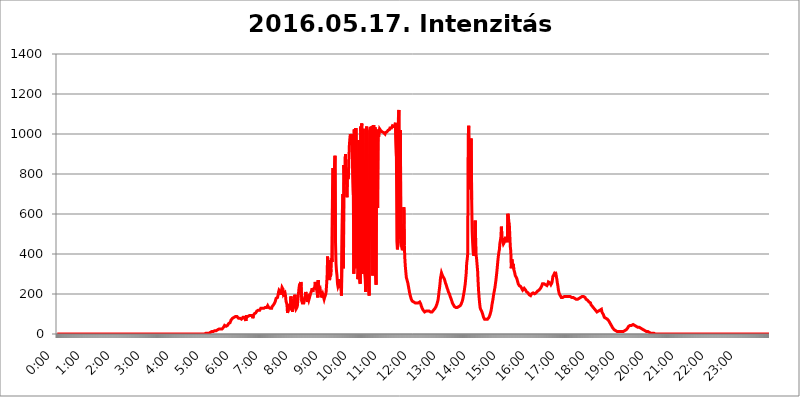
| Category | 2016.05.17. Intenzitás [W/m^2] |
|---|---|
| 0.0 | 0 |
| 0.0006944444444444445 | 0 |
| 0.001388888888888889 | 0 |
| 0.0020833333333333333 | 0 |
| 0.002777777777777778 | 0 |
| 0.003472222222222222 | 0 |
| 0.004166666666666667 | 0 |
| 0.004861111111111111 | 0 |
| 0.005555555555555556 | 0 |
| 0.0062499999999999995 | 0 |
| 0.006944444444444444 | 0 |
| 0.007638888888888889 | 0 |
| 0.008333333333333333 | 0 |
| 0.009027777777777779 | 0 |
| 0.009722222222222222 | 0 |
| 0.010416666666666666 | 0 |
| 0.011111111111111112 | 0 |
| 0.011805555555555555 | 0 |
| 0.012499999999999999 | 0 |
| 0.013194444444444444 | 0 |
| 0.013888888888888888 | 0 |
| 0.014583333333333332 | 0 |
| 0.015277777777777777 | 0 |
| 0.015972222222222224 | 0 |
| 0.016666666666666666 | 0 |
| 0.017361111111111112 | 0 |
| 0.018055555555555557 | 0 |
| 0.01875 | 0 |
| 0.019444444444444445 | 0 |
| 0.02013888888888889 | 0 |
| 0.020833333333333332 | 0 |
| 0.02152777777777778 | 0 |
| 0.022222222222222223 | 0 |
| 0.02291666666666667 | 0 |
| 0.02361111111111111 | 0 |
| 0.024305555555555556 | 0 |
| 0.024999999999999998 | 0 |
| 0.025694444444444447 | 0 |
| 0.02638888888888889 | 0 |
| 0.027083333333333334 | 0 |
| 0.027777777777777776 | 0 |
| 0.02847222222222222 | 0 |
| 0.029166666666666664 | 0 |
| 0.029861111111111113 | 0 |
| 0.030555555555555555 | 0 |
| 0.03125 | 0 |
| 0.03194444444444445 | 0 |
| 0.03263888888888889 | 0 |
| 0.03333333333333333 | 0 |
| 0.034027777777777775 | 0 |
| 0.034722222222222224 | 0 |
| 0.035416666666666666 | 0 |
| 0.036111111111111115 | 0 |
| 0.03680555555555556 | 0 |
| 0.0375 | 0 |
| 0.03819444444444444 | 0 |
| 0.03888888888888889 | 0 |
| 0.03958333333333333 | 0 |
| 0.04027777777777778 | 0 |
| 0.04097222222222222 | 0 |
| 0.041666666666666664 | 0 |
| 0.042361111111111106 | 0 |
| 0.04305555555555556 | 0 |
| 0.043750000000000004 | 0 |
| 0.044444444444444446 | 0 |
| 0.04513888888888889 | 0 |
| 0.04583333333333334 | 0 |
| 0.04652777777777778 | 0 |
| 0.04722222222222222 | 0 |
| 0.04791666666666666 | 0 |
| 0.04861111111111111 | 0 |
| 0.049305555555555554 | 0 |
| 0.049999999999999996 | 0 |
| 0.05069444444444445 | 0 |
| 0.051388888888888894 | 0 |
| 0.052083333333333336 | 0 |
| 0.05277777777777778 | 0 |
| 0.05347222222222222 | 0 |
| 0.05416666666666667 | 0 |
| 0.05486111111111111 | 0 |
| 0.05555555555555555 | 0 |
| 0.05625 | 0 |
| 0.05694444444444444 | 0 |
| 0.057638888888888885 | 0 |
| 0.05833333333333333 | 0 |
| 0.05902777777777778 | 0 |
| 0.059722222222222225 | 0 |
| 0.06041666666666667 | 0 |
| 0.061111111111111116 | 0 |
| 0.06180555555555556 | 0 |
| 0.0625 | 0 |
| 0.06319444444444444 | 0 |
| 0.06388888888888888 | 0 |
| 0.06458333333333334 | 0 |
| 0.06527777777777778 | 0 |
| 0.06597222222222222 | 0 |
| 0.06666666666666667 | 0 |
| 0.06736111111111111 | 0 |
| 0.06805555555555555 | 0 |
| 0.06874999999999999 | 0 |
| 0.06944444444444443 | 0 |
| 0.07013888888888889 | 0 |
| 0.07083333333333333 | 0 |
| 0.07152777777777779 | 0 |
| 0.07222222222222223 | 0 |
| 0.07291666666666667 | 0 |
| 0.07361111111111111 | 0 |
| 0.07430555555555556 | 0 |
| 0.075 | 0 |
| 0.07569444444444444 | 0 |
| 0.0763888888888889 | 0 |
| 0.07708333333333334 | 0 |
| 0.07777777777777778 | 0 |
| 0.07847222222222222 | 0 |
| 0.07916666666666666 | 0 |
| 0.0798611111111111 | 0 |
| 0.08055555555555556 | 0 |
| 0.08125 | 0 |
| 0.08194444444444444 | 0 |
| 0.08263888888888889 | 0 |
| 0.08333333333333333 | 0 |
| 0.08402777777777777 | 0 |
| 0.08472222222222221 | 0 |
| 0.08541666666666665 | 0 |
| 0.08611111111111112 | 0 |
| 0.08680555555555557 | 0 |
| 0.08750000000000001 | 0 |
| 0.08819444444444445 | 0 |
| 0.08888888888888889 | 0 |
| 0.08958333333333333 | 0 |
| 0.09027777777777778 | 0 |
| 0.09097222222222222 | 0 |
| 0.09166666666666667 | 0 |
| 0.09236111111111112 | 0 |
| 0.09305555555555556 | 0 |
| 0.09375 | 0 |
| 0.09444444444444444 | 0 |
| 0.09513888888888888 | 0 |
| 0.09583333333333333 | 0 |
| 0.09652777777777777 | 0 |
| 0.09722222222222222 | 0 |
| 0.09791666666666667 | 0 |
| 0.09861111111111111 | 0 |
| 0.09930555555555555 | 0 |
| 0.09999999999999999 | 0 |
| 0.10069444444444443 | 0 |
| 0.1013888888888889 | 0 |
| 0.10208333333333335 | 0 |
| 0.10277777777777779 | 0 |
| 0.10347222222222223 | 0 |
| 0.10416666666666667 | 0 |
| 0.10486111111111111 | 0 |
| 0.10555555555555556 | 0 |
| 0.10625 | 0 |
| 0.10694444444444444 | 0 |
| 0.1076388888888889 | 0 |
| 0.10833333333333334 | 0 |
| 0.10902777777777778 | 0 |
| 0.10972222222222222 | 0 |
| 0.1111111111111111 | 0 |
| 0.11180555555555556 | 0 |
| 0.11180555555555556 | 0 |
| 0.1125 | 0 |
| 0.11319444444444444 | 0 |
| 0.11388888888888889 | 0 |
| 0.11458333333333333 | 0 |
| 0.11527777777777777 | 0 |
| 0.11597222222222221 | 0 |
| 0.11666666666666665 | 0 |
| 0.1173611111111111 | 0 |
| 0.11805555555555557 | 0 |
| 0.11944444444444445 | 0 |
| 0.12013888888888889 | 0 |
| 0.12083333333333333 | 0 |
| 0.12152777777777778 | 0 |
| 0.12222222222222223 | 0 |
| 0.12291666666666667 | 0 |
| 0.12291666666666667 | 0 |
| 0.12361111111111112 | 0 |
| 0.12430555555555556 | 0 |
| 0.125 | 0 |
| 0.12569444444444444 | 0 |
| 0.12638888888888888 | 0 |
| 0.12708333333333333 | 0 |
| 0.16875 | 0 |
| 0.12847222222222224 | 0 |
| 0.12916666666666668 | 0 |
| 0.12986111111111112 | 0 |
| 0.13055555555555556 | 0 |
| 0.13125 | 0 |
| 0.13194444444444445 | 0 |
| 0.1326388888888889 | 0 |
| 0.13333333333333333 | 0 |
| 0.13402777777777777 | 0 |
| 0.13402777777777777 | 0 |
| 0.13472222222222222 | 0 |
| 0.13541666666666666 | 0 |
| 0.1361111111111111 | 0 |
| 0.13749999999999998 | 0 |
| 0.13819444444444443 | 0 |
| 0.1388888888888889 | 0 |
| 0.13958333333333334 | 0 |
| 0.14027777777777778 | 0 |
| 0.14097222222222222 | 0 |
| 0.14166666666666666 | 0 |
| 0.1423611111111111 | 0 |
| 0.14305555555555557 | 0 |
| 0.14375000000000002 | 0 |
| 0.14444444444444446 | 0 |
| 0.1451388888888889 | 0 |
| 0.1451388888888889 | 0 |
| 0.14652777777777778 | 0 |
| 0.14722222222222223 | 0 |
| 0.14791666666666667 | 0 |
| 0.1486111111111111 | 0 |
| 0.14930555555555555 | 0 |
| 0.15 | 0 |
| 0.15069444444444444 | 0 |
| 0.15138888888888888 | 0 |
| 0.15208333333333332 | 0 |
| 0.15277777777777776 | 0 |
| 0.15347222222222223 | 0 |
| 0.15416666666666667 | 0 |
| 0.15486111111111112 | 0 |
| 0.15555555555555556 | 0 |
| 0.15625 | 0 |
| 0.15694444444444444 | 0 |
| 0.15763888888888888 | 0 |
| 0.15833333333333333 | 0 |
| 0.15902777777777777 | 0 |
| 0.15972222222222224 | 0 |
| 0.16041666666666668 | 0 |
| 0.16111111111111112 | 0 |
| 0.16180555555555556 | 0 |
| 0.1625 | 0 |
| 0.16319444444444445 | 0 |
| 0.1638888888888889 | 0 |
| 0.16458333333333333 | 0 |
| 0.16527777777777777 | 0 |
| 0.16597222222222222 | 0 |
| 0.16666666666666666 | 0 |
| 0.1673611111111111 | 0 |
| 0.16805555555555554 | 0 |
| 0.16874999999999998 | 0 |
| 0.16944444444444443 | 0 |
| 0.17013888888888887 | 0 |
| 0.1708333333333333 | 0 |
| 0.17152777777777775 | 0 |
| 0.17222222222222225 | 0 |
| 0.1729166666666667 | 0 |
| 0.17361111111111113 | 0 |
| 0.17430555555555557 | 0 |
| 0.17500000000000002 | 0 |
| 0.17569444444444446 | 0 |
| 0.1763888888888889 | 0 |
| 0.17708333333333334 | 0 |
| 0.17777777777777778 | 0 |
| 0.17847222222222223 | 0 |
| 0.17916666666666667 | 0 |
| 0.1798611111111111 | 0 |
| 0.18055555555555555 | 0 |
| 0.18125 | 0 |
| 0.18194444444444444 | 0 |
| 0.1826388888888889 | 0 |
| 0.18333333333333335 | 0 |
| 0.1840277777777778 | 0 |
| 0.18472222222222223 | 0 |
| 0.18541666666666667 | 0 |
| 0.18611111111111112 | 0 |
| 0.18680555555555556 | 0 |
| 0.1875 | 0 |
| 0.18819444444444444 | 0 |
| 0.18888888888888888 | 0 |
| 0.18958333333333333 | 0 |
| 0.19027777777777777 | 0 |
| 0.1909722222222222 | 0 |
| 0.19166666666666665 | 0 |
| 0.19236111111111112 | 0 |
| 0.19305555555555554 | 0 |
| 0.19375 | 0 |
| 0.19444444444444445 | 0 |
| 0.1951388888888889 | 0 |
| 0.19583333333333333 | 0 |
| 0.19652777777777777 | 0 |
| 0.19722222222222222 | 0 |
| 0.19791666666666666 | 0 |
| 0.1986111111111111 | 0 |
| 0.19930555555555554 | 0 |
| 0.19999999999999998 | 0 |
| 0.20069444444444443 | 0 |
| 0.20138888888888887 | 0 |
| 0.2020833333333333 | 0 |
| 0.2027777777777778 | 0 |
| 0.2034722222222222 | 0 |
| 0.2041666666666667 | 0 |
| 0.20486111111111113 | 0 |
| 0.20555555555555557 | 0 |
| 0.20625000000000002 | 0 |
| 0.20694444444444446 | 0 |
| 0.2076388888888889 | 0 |
| 0.20833333333333334 | 3.525 |
| 0.20902777777777778 | 3.525 |
| 0.20972222222222223 | 3.525 |
| 0.21041666666666667 | 3.525 |
| 0.2111111111111111 | 3.525 |
| 0.21180555555555555 | 3.525 |
| 0.2125 | 3.525 |
| 0.21319444444444444 | 7.887 |
| 0.2138888888888889 | 7.887 |
| 0.21458333333333335 | 7.887 |
| 0.2152777777777778 | 7.887 |
| 0.21597222222222223 | 12.257 |
| 0.21666666666666667 | 12.257 |
| 0.21736111111111112 | 12.257 |
| 0.21805555555555556 | 12.257 |
| 0.21875 | 12.257 |
| 0.21944444444444444 | 16.636 |
| 0.22013888888888888 | 16.636 |
| 0.22083333333333333 | 16.636 |
| 0.22152777777777777 | 16.636 |
| 0.2222222222222222 | 16.636 |
| 0.22291666666666665 | 16.636 |
| 0.2236111111111111 | 16.636 |
| 0.22430555555555556 | 21.024 |
| 0.225 | 21.024 |
| 0.22569444444444445 | 21.024 |
| 0.2263888888888889 | 21.024 |
| 0.22708333333333333 | 25.419 |
| 0.22777777777777777 | 29.823 |
| 0.22847222222222222 | 29.823 |
| 0.22916666666666666 | 25.419 |
| 0.2298611111111111 | 25.419 |
| 0.23055555555555554 | 25.419 |
| 0.23124999999999998 | 25.419 |
| 0.23194444444444443 | 29.823 |
| 0.23263888888888887 | 29.823 |
| 0.2333333333333333 | 34.234 |
| 0.2340277777777778 | 38.653 |
| 0.2347222222222222 | 43.079 |
| 0.2354166666666667 | 43.079 |
| 0.23611111111111113 | 38.653 |
| 0.23680555555555557 | 38.653 |
| 0.23750000000000002 | 38.653 |
| 0.23819444444444446 | 43.079 |
| 0.2388888888888889 | 43.079 |
| 0.23958333333333334 | 47.511 |
| 0.24027777777777778 | 51.951 |
| 0.24097222222222223 | 56.398 |
| 0.24166666666666667 | 51.951 |
| 0.2423611111111111 | 56.398 |
| 0.24305555555555555 | 60.85 |
| 0.24375 | 69.775 |
| 0.24444444444444446 | 74.246 |
| 0.24513888888888888 | 74.246 |
| 0.24583333333333335 | 78.722 |
| 0.2465277777777778 | 78.722 |
| 0.24722222222222223 | 83.205 |
| 0.24791666666666667 | 83.205 |
| 0.24861111111111112 | 83.205 |
| 0.24930555555555556 | 87.692 |
| 0.25 | 87.692 |
| 0.25069444444444444 | 92.184 |
| 0.2513888888888889 | 92.184 |
| 0.2520833333333333 | 87.692 |
| 0.25277777777777777 | 83.205 |
| 0.2534722222222222 | 83.205 |
| 0.25416666666666665 | 78.722 |
| 0.2548611111111111 | 78.722 |
| 0.2555555555555556 | 78.722 |
| 0.25625000000000003 | 78.722 |
| 0.2569444444444445 | 74.246 |
| 0.2576388888888889 | 74.246 |
| 0.25833333333333336 | 74.246 |
| 0.2590277777777778 | 74.246 |
| 0.25972222222222224 | 78.722 |
| 0.2604166666666667 | 83.205 |
| 0.2611111111111111 | 87.692 |
| 0.26180555555555557 | 87.692 |
| 0.2625 | 83.205 |
| 0.26319444444444445 | 83.205 |
| 0.2638888888888889 | 83.205 |
| 0.26458333333333334 | 65.31 |
| 0.2652777777777778 | 87.692 |
| 0.2659722222222222 | 87.692 |
| 0.26666666666666666 | 87.692 |
| 0.2673611111111111 | 87.692 |
| 0.26805555555555555 | 92.184 |
| 0.26875 | 92.184 |
| 0.26944444444444443 | 92.184 |
| 0.2701388888888889 | 92.184 |
| 0.2708333333333333 | 92.184 |
| 0.27152777777777776 | 92.184 |
| 0.2722222222222222 | 92.184 |
| 0.27291666666666664 | 92.184 |
| 0.2736111111111111 | 92.184 |
| 0.2743055555555555 | 78.722 |
| 0.27499999999999997 | 92.184 |
| 0.27569444444444446 | 96.682 |
| 0.27638888888888885 | 101.184 |
| 0.27708333333333335 | 101.184 |
| 0.2777777777777778 | 101.184 |
| 0.27847222222222223 | 105.69 |
| 0.2791666666666667 | 110.201 |
| 0.2798611111111111 | 114.716 |
| 0.28055555555555556 | 114.716 |
| 0.28125 | 119.235 |
| 0.28194444444444444 | 119.235 |
| 0.2826388888888889 | 119.235 |
| 0.2833333333333333 | 119.235 |
| 0.28402777777777777 | 119.235 |
| 0.2847222222222222 | 123.758 |
| 0.28541666666666665 | 128.284 |
| 0.28611111111111115 | 128.284 |
| 0.28680555555555554 | 128.284 |
| 0.28750000000000003 | 128.284 |
| 0.2881944444444445 | 123.758 |
| 0.2888888888888889 | 123.758 |
| 0.28958333333333336 | 128.284 |
| 0.2902777777777778 | 132.814 |
| 0.29097222222222224 | 132.814 |
| 0.2916666666666667 | 132.814 |
| 0.2923611111111111 | 132.814 |
| 0.29305555555555557 | 132.814 |
| 0.29375 | 132.814 |
| 0.29444444444444445 | 137.347 |
| 0.2951388888888889 | 141.884 |
| 0.29583333333333334 | 137.347 |
| 0.2965277777777778 | 132.814 |
| 0.2972222222222222 | 137.347 |
| 0.29791666666666666 | 132.814 |
| 0.2986111111111111 | 128.284 |
| 0.29930555555555555 | 128.284 |
| 0.3 | 128.284 |
| 0.30069444444444443 | 128.284 |
| 0.3013888888888889 | 137.347 |
| 0.3020833333333333 | 137.347 |
| 0.30277777777777776 | 141.884 |
| 0.3034722222222222 | 146.423 |
| 0.30416666666666664 | 146.423 |
| 0.3048611111111111 | 141.884 |
| 0.3055555555555555 | 160.056 |
| 0.30624999999999997 | 164.605 |
| 0.3069444444444444 | 178.264 |
| 0.3076388888888889 | 178.264 |
| 0.30833333333333335 | 182.82 |
| 0.3090277777777778 | 182.82 |
| 0.30972222222222223 | 187.378 |
| 0.3104166666666667 | 210.182 |
| 0.3111111111111111 | 219.309 |
| 0.31180555555555556 | 223.873 |
| 0.3125 | 219.309 |
| 0.31319444444444444 | 210.182 |
| 0.3138888888888889 | 196.497 |
| 0.3145833333333333 | 219.309 |
| 0.31527777777777777 | 233 |
| 0.3159722222222222 | 237.564 |
| 0.31666666666666665 | 223.873 |
| 0.31736111111111115 | 196.497 |
| 0.31805555555555554 | 196.497 |
| 0.31875000000000003 | 196.497 |
| 0.3194444444444445 | 205.62 |
| 0.3201388888888889 | 191.937 |
| 0.32083333333333336 | 164.605 |
| 0.3215277777777778 | 164.605 |
| 0.32222222222222224 | 146.423 |
| 0.3229166666666667 | 105.69 |
| 0.3236111111111111 | 101.184 |
| 0.32430555555555557 | 123.758 |
| 0.325 | 150.964 |
| 0.32569444444444445 | 146.423 |
| 0.3263888888888889 | 155.509 |
| 0.32708333333333334 | 128.284 |
| 0.3277777777777778 | 187.378 |
| 0.3284722222222222 | 119.235 |
| 0.32916666666666666 | 173.709 |
| 0.3298611111111111 | 110.201 |
| 0.33055555555555555 | 155.509 |
| 0.33125 | 141.884 |
| 0.33194444444444443 | 164.605 |
| 0.3326388888888889 | 132.814 |
| 0.3333333333333333 | 196.497 |
| 0.3340277777777778 | 132.814 |
| 0.3347222222222222 | 123.758 |
| 0.3354166666666667 | 128.284 |
| 0.3361111111111111 | 132.814 |
| 0.3368055555555556 | 141.884 |
| 0.33749999999999997 | 141.884 |
| 0.33819444444444446 | 141.884 |
| 0.33888888888888885 | 223.873 |
| 0.33958333333333335 | 242.127 |
| 0.34027777777777773 | 251.251 |
| 0.34097222222222223 | 214.746 |
| 0.3416666666666666 | 260.373 |
| 0.3423611111111111 | 255.813 |
| 0.3430555555555555 | 164.605 |
| 0.34375 | 155.509 |
| 0.3444444444444445 | 150.964 |
| 0.3451388888888889 | 150.964 |
| 0.3458333333333334 | 155.509 |
| 0.34652777777777777 | 160.056 |
| 0.34722222222222227 | 178.264 |
| 0.34791666666666665 | 196.497 |
| 0.34861111111111115 | 210.182 |
| 0.34930555555555554 | 205.62 |
| 0.35000000000000003 | 178.264 |
| 0.3506944444444444 | 160.056 |
| 0.3513888888888889 | 169.156 |
| 0.3520833333333333 | 178.264 |
| 0.3527777777777778 | 169.156 |
| 0.3534722222222222 | 178.264 |
| 0.3541666666666667 | 187.378 |
| 0.3548611111111111 | 196.497 |
| 0.35555555555555557 | 196.497 |
| 0.35625 | 201.058 |
| 0.35694444444444445 | 219.309 |
| 0.3576388888888889 | 228.436 |
| 0.35833333333333334 | 210.182 |
| 0.3590277777777778 | 223.873 |
| 0.3597222222222222 | 228.436 |
| 0.36041666666666666 | 223.873 |
| 0.3611111111111111 | 233 |
| 0.36180555555555555 | 260.373 |
| 0.3625 | 260.373 |
| 0.36319444444444443 | 228.436 |
| 0.3638888888888889 | 219.309 |
| 0.3645833333333333 | 205.62 |
| 0.3652777777777778 | 182.82 |
| 0.3659722222222222 | 269.49 |
| 0.3666666666666667 | 223.873 |
| 0.3673611111111111 | 214.746 |
| 0.3680555555555556 | 210.182 |
| 0.36874999999999997 | 223.873 |
| 0.36944444444444446 | 205.62 |
| 0.37013888888888885 | 182.82 |
| 0.37083333333333335 | 178.264 |
| 0.37152777777777773 | 187.378 |
| 0.37222222222222223 | 201.058 |
| 0.3729166666666666 | 196.497 |
| 0.3736111111111111 | 182.82 |
| 0.3743055555555555 | 173.709 |
| 0.375 | 182.82 |
| 0.3756944444444445 | 187.378 |
| 0.3763888888888889 | 196.497 |
| 0.3770833333333334 | 210.182 |
| 0.37777777777777777 | 246.689 |
| 0.37847222222222227 | 287.709 |
| 0.37916666666666665 | 387.202 |
| 0.37986111111111115 | 319.517 |
| 0.38055555555555554 | 369.23 |
| 0.38125000000000003 | 287.709 |
| 0.3819444444444444 | 269.49 |
| 0.3826388888888889 | 296.808 |
| 0.3833333333333333 | 287.709 |
| 0.3840277777777778 | 324.052 |
| 0.3847222222222222 | 378.224 |
| 0.3854166666666667 | 360.221 |
| 0.3861111111111111 | 727.896 |
| 0.38680555555555557 | 829.981 |
| 0.3875 | 545.416 |
| 0.38819444444444445 | 613.252 |
| 0.3888888888888889 | 845.365 |
| 0.38958333333333334 | 891.099 |
| 0.3902777777777778 | 458.38 |
| 0.3909722222222222 | 351.198 |
| 0.39166666666666666 | 314.98 |
| 0.3923611111111111 | 292.259 |
| 0.39305555555555555 | 251.251 |
| 0.39375 | 237.564 |
| 0.39444444444444443 | 242.127 |
| 0.3951388888888889 | 251.251 |
| 0.3958333333333333 | 274.047 |
| 0.3965277777777778 | 237.564 |
| 0.3972222222222222 | 242.127 |
| 0.3979166666666667 | 228.436 |
| 0.3986111111111111 | 191.937 |
| 0.3993055555555556 | 196.497 |
| 0.39999999999999997 | 621.613 |
| 0.40069444444444446 | 699.717 |
| 0.40138888888888885 | 328.584 |
| 0.40208333333333335 | 845.365 |
| 0.40277777777777773 | 798.974 |
| 0.40347222222222223 | 759.723 |
| 0.4041666666666666 | 898.668 |
| 0.4048611111111111 | 829.981 |
| 0.4055555555555555 | 798.974 |
| 0.40625 | 683.473 |
| 0.4069444444444445 | 798.974 |
| 0.4076388888888889 | 775.492 |
| 0.4083333333333334 | 783.342 |
| 0.40902777777777777 | 875.918 |
| 0.40972222222222227 | 943.832 |
| 0.41041666666666665 | 977.508 |
| 0.41111111111111115 | 999.916 |
| 0.41180555555555554 | 981.244 |
| 0.41250000000000003 | 988.714 |
| 0.4131944444444444 | 999.916 |
| 0.4138888888888889 | 1003.65 |
| 0.4145833333333333 | 1003.65 |
| 0.4152777777777778 | 695.666 |
| 0.4159722222222222 | 301.354 |
| 0.4166666666666667 | 1022.323 |
| 0.4173611111111111 | 440.702 |
| 0.41805555555555557 | 328.584 |
| 0.41875 | 1029.798 |
| 0.41944444444444445 | 1026.06 |
| 0.4201388888888889 | 814.519 |
| 0.42083333333333334 | 658.909 |
| 0.4215277777777778 | 274.047 |
| 0.4222222222222222 | 305.898 |
| 0.42291666666666666 | 970.034 |
| 0.4236111111111111 | 328.584 |
| 0.42430555555555555 | 260.373 |
| 0.425 | 251.251 |
| 0.42569444444444443 | 1037.277 |
| 0.4263888888888889 | 1014.852 |
| 0.4270833333333333 | 1052.255 |
| 0.4277777777777778 | 301.354 |
| 0.4284722222222222 | 445.129 |
| 0.4291666666666667 | 1026.06 |
| 0.4298611111111111 | 1029.798 |
| 0.4305555555555556 | 360.221 |
| 0.43124999999999997 | 301.354 |
| 0.43194444444444446 | 274.047 |
| 0.43263888888888885 | 210.182 |
| 0.43333333333333335 | 1018.587 |
| 0.43402777777777773 | 1037.277 |
| 0.43472222222222223 | 775.492 |
| 0.4354166666666666 | 305.898 |
| 0.4361111111111111 | 274.047 |
| 0.4368055555555555 | 223.873 |
| 0.4375 | 191.937 |
| 0.4381944444444445 | 1018.587 |
| 0.4388888888888889 | 1029.798 |
| 0.4395833333333334 | 1029.798 |
| 0.44027777777777777 | 1026.06 |
| 0.44097222222222227 | 1033.537 |
| 0.44166666666666665 | 1037.277 |
| 0.44236111111111115 | 292.259 |
| 0.44305555555555554 | 613.252 |
| 0.44375000000000003 | 1044.762 |
| 0.4444444444444444 | 996.182 |
| 0.4451388888888889 | 1007.383 |
| 0.4458333333333333 | 1033.537 |
| 0.4465277777777778 | 287.709 |
| 0.4472222222222222 | 246.689 |
| 0.4479166666666667 | 1011.118 |
| 0.4486111111111111 | 1022.323 |
| 0.44930555555555557 | 629.948 |
| 0.45 | 1011.118 |
| 0.45069444444444445 | 984.98 |
| 0.4513888888888889 | 1011.118 |
| 0.45208333333333334 | 1026.06 |
| 0.4527777777777778 | 1022.323 |
| 0.4534722222222222 | 1018.587 |
| 0.45416666666666666 | 1014.852 |
| 0.4548611111111111 | 1014.852 |
| 0.45555555555555555 | 1011.118 |
| 0.45625 | 1007.383 |
| 0.45694444444444443 | 1007.383 |
| 0.4576388888888889 | 1007.383 |
| 0.4583333333333333 | 1007.383 |
| 0.4590277777777778 | 1007.383 |
| 0.4597222222222222 | 999.916 |
| 0.4604166666666667 | 1007.383 |
| 0.4611111111111111 | 1003.65 |
| 0.4618055555555556 | 1007.383 |
| 0.46249999999999997 | 1011.118 |
| 0.46319444444444446 | 1007.383 |
| 0.46388888888888885 | 1018.587 |
| 0.46458333333333335 | 1014.852 |
| 0.46527777777777773 | 1018.587 |
| 0.46597222222222223 | 1022.323 |
| 0.4666666666666666 | 1029.798 |
| 0.4673611111111111 | 1033.537 |
| 0.4680555555555555 | 1033.537 |
| 0.46875 | 1029.798 |
| 0.4694444444444445 | 1033.537 |
| 0.4701388888888889 | 1041.019 |
| 0.4708333333333334 | 1041.019 |
| 0.47152777777777777 | 1037.277 |
| 0.47222222222222227 | 1037.277 |
| 0.47291666666666665 | 1041.019 |
| 0.47361111111111115 | 1044.762 |
| 0.47430555555555554 | 1056.004 |
| 0.47500000000000003 | 1059.756 |
| 0.4756944444444444 | 887.309 |
| 0.4763888888888889 | 462.786 |
| 0.4770833333333333 | 422.943 |
| 0.4777777777777778 | 449.551 |
| 0.4784722222222222 | 1078.555 |
| 0.4791666666666667 | 1120.238 |
| 0.4798611111111111 | 515.223 |
| 0.48055555555555557 | 475.972 |
| 0.48125 | 1018.587 |
| 0.48194444444444445 | 453.968 |
| 0.4826388888888889 | 453.968 |
| 0.48333333333333334 | 449.551 |
| 0.4840277777777778 | 418.492 |
| 0.4847222222222222 | 427.39 |
| 0.48541666666666666 | 445.129 |
| 0.4861111111111111 | 634.105 |
| 0.48680555555555555 | 445.129 |
| 0.4875 | 378.224 |
| 0.48819444444444443 | 337.639 |
| 0.4888888888888889 | 310.44 |
| 0.4895833333333333 | 283.156 |
| 0.4902777777777778 | 274.047 |
| 0.4909722222222222 | 264.932 |
| 0.4916666666666667 | 255.813 |
| 0.4923611111111111 | 242.127 |
| 0.4930555555555556 | 228.436 |
| 0.49374999999999997 | 214.746 |
| 0.49444444444444446 | 201.058 |
| 0.49513888888888885 | 191.937 |
| 0.49583333333333335 | 182.82 |
| 0.49652777777777773 | 173.709 |
| 0.49722222222222223 | 169.156 |
| 0.4979166666666666 | 164.605 |
| 0.4986111111111111 | 160.056 |
| 0.4993055555555555 | 160.056 |
| 0.5 | 160.056 |
| 0.5006944444444444 | 155.509 |
| 0.5013888888888889 | 155.509 |
| 0.5020833333333333 | 155.509 |
| 0.5027777777777778 | 155.509 |
| 0.5034722222222222 | 155.509 |
| 0.5041666666666667 | 155.509 |
| 0.5048611111111111 | 155.509 |
| 0.5055555555555555 | 155.509 |
| 0.50625 | 155.509 |
| 0.5069444444444444 | 160.056 |
| 0.5076388888888889 | 160.056 |
| 0.5083333333333333 | 160.056 |
| 0.5090277777777777 | 155.509 |
| 0.5097222222222222 | 150.964 |
| 0.5104166666666666 | 141.884 |
| 0.5111111111111112 | 137.347 |
| 0.5118055555555555 | 128.284 |
| 0.5125000000000001 | 123.758 |
| 0.5131944444444444 | 119.235 |
| 0.513888888888889 | 114.716 |
| 0.5145833333333333 | 114.716 |
| 0.5152777777777778 | 110.201 |
| 0.5159722222222222 | 110.201 |
| 0.5166666666666667 | 110.201 |
| 0.517361111111111 | 114.716 |
| 0.5180555555555556 | 114.716 |
| 0.5187499999999999 | 114.716 |
| 0.5194444444444445 | 114.716 |
| 0.5201388888888888 | 114.716 |
| 0.5208333333333334 | 114.716 |
| 0.5215277777777778 | 114.716 |
| 0.5222222222222223 | 114.716 |
| 0.5229166666666667 | 114.716 |
| 0.5236111111111111 | 110.201 |
| 0.5243055555555556 | 110.201 |
| 0.525 | 105.69 |
| 0.5256944444444445 | 110.201 |
| 0.5263888888888889 | 114.716 |
| 0.5270833333333333 | 114.716 |
| 0.5277777777777778 | 119.235 |
| 0.5284722222222222 | 119.235 |
| 0.5291666666666667 | 123.758 |
| 0.5298611111111111 | 128.284 |
| 0.5305555555555556 | 132.814 |
| 0.53125 | 137.347 |
| 0.5319444444444444 | 141.884 |
| 0.5326388888888889 | 150.964 |
| 0.5333333333333333 | 160.056 |
| 0.5340277777777778 | 169.156 |
| 0.5347222222222222 | 187.378 |
| 0.5354166666666667 | 210.182 |
| 0.5361111111111111 | 228.436 |
| 0.5368055555555555 | 251.251 |
| 0.5375 | 278.603 |
| 0.5381944444444444 | 292.259 |
| 0.5388888888888889 | 305.898 |
| 0.5395833333333333 | 301.354 |
| 0.5402777777777777 | 292.259 |
| 0.5409722222222222 | 287.709 |
| 0.5416666666666666 | 283.156 |
| 0.5423611111111112 | 278.603 |
| 0.5430555555555555 | 274.047 |
| 0.5437500000000001 | 264.932 |
| 0.5444444444444444 | 255.813 |
| 0.545138888888889 | 251.251 |
| 0.5458333333333333 | 242.127 |
| 0.5465277777777778 | 233 |
| 0.5472222222222222 | 228.436 |
| 0.5479166666666667 | 219.309 |
| 0.548611111111111 | 210.182 |
| 0.5493055555555556 | 205.62 |
| 0.5499999999999999 | 201.058 |
| 0.5506944444444445 | 191.937 |
| 0.5513888888888888 | 187.378 |
| 0.5520833333333334 | 178.264 |
| 0.5527777777777778 | 173.709 |
| 0.5534722222222223 | 164.605 |
| 0.5541666666666667 | 155.509 |
| 0.5548611111111111 | 150.964 |
| 0.5555555555555556 | 146.423 |
| 0.55625 | 146.423 |
| 0.5569444444444445 | 137.347 |
| 0.5576388888888889 | 137.347 |
| 0.5583333333333333 | 132.814 |
| 0.5590277777777778 | 132.814 |
| 0.5597222222222222 | 128.284 |
| 0.5604166666666667 | 132.814 |
| 0.5611111111111111 | 132.814 |
| 0.5618055555555556 | 132.814 |
| 0.5625 | 137.347 |
| 0.5631944444444444 | 137.347 |
| 0.5638888888888889 | 137.347 |
| 0.5645833333333333 | 137.347 |
| 0.5652777777777778 | 141.884 |
| 0.5659722222222222 | 146.423 |
| 0.5666666666666667 | 150.964 |
| 0.5673611111111111 | 155.509 |
| 0.5680555555555555 | 164.605 |
| 0.56875 | 173.709 |
| 0.5694444444444444 | 187.378 |
| 0.5701388888888889 | 201.058 |
| 0.5708333333333333 | 214.746 |
| 0.5715277777777777 | 233 |
| 0.5722222222222222 | 251.251 |
| 0.5729166666666666 | 278.603 |
| 0.5736111111111112 | 305.898 |
| 0.5743055555555555 | 355.712 |
| 0.5750000000000001 | 373.729 |
| 0.5756944444444444 | 400.638 |
| 0.576388888888889 | 981.244 |
| 0.5770833333333333 | 1041.019 |
| 0.5777777777777778 | 723.889 |
| 0.5784722222222222 | 837.682 |
| 0.5791666666666667 | 868.305 |
| 0.579861111111111 | 955.071 |
| 0.5805555555555556 | 977.508 |
| 0.5812499999999999 | 671.22 |
| 0.5819444444444445 | 510.885 |
| 0.5826388888888888 | 453.968 |
| 0.5833333333333334 | 409.574 |
| 0.5840277777777778 | 391.685 |
| 0.5847222222222223 | 422.943 |
| 0.5854166666666667 | 409.574 |
| 0.5861111111111111 | 566.793 |
| 0.5868055555555556 | 475.972 |
| 0.5875 | 396.164 |
| 0.5881944444444445 | 373.729 |
| 0.5888888888888889 | 373.729 |
| 0.5895833333333333 | 314.98 |
| 0.5902777777777778 | 260.373 |
| 0.5909722222222222 | 214.746 |
| 0.5916666666666667 | 182.82 |
| 0.5923611111111111 | 155.509 |
| 0.5930555555555556 | 132.814 |
| 0.59375 | 123.758 |
| 0.5944444444444444 | 119.235 |
| 0.5951388888888889 | 114.716 |
| 0.5958333333333333 | 110.201 |
| 0.5965277777777778 | 101.184 |
| 0.5972222222222222 | 92.184 |
| 0.5979166666666667 | 83.205 |
| 0.5986111111111111 | 78.722 |
| 0.5993055555555555 | 74.246 |
| 0.6 | 74.246 |
| 0.6006944444444444 | 74.246 |
| 0.6013888888888889 | 74.246 |
| 0.6020833333333333 | 74.246 |
| 0.6027777777777777 | 74.246 |
| 0.6034722222222222 | 74.246 |
| 0.6041666666666666 | 78.722 |
| 0.6048611111111112 | 78.722 |
| 0.6055555555555555 | 83.205 |
| 0.6062500000000001 | 87.692 |
| 0.6069444444444444 | 96.682 |
| 0.607638888888889 | 105.69 |
| 0.6083333333333333 | 114.716 |
| 0.6090277777777778 | 128.284 |
| 0.6097222222222222 | 146.423 |
| 0.6104166666666667 | 160.056 |
| 0.611111111111111 | 173.709 |
| 0.6118055555555556 | 191.937 |
| 0.6124999999999999 | 205.62 |
| 0.6131944444444445 | 219.309 |
| 0.6138888888888888 | 233 |
| 0.6145833333333334 | 251.251 |
| 0.6152777777777778 | 269.49 |
| 0.6159722222222223 | 292.259 |
| 0.6166666666666667 | 314.98 |
| 0.6173611111111111 | 342.162 |
| 0.6180555555555556 | 369.23 |
| 0.61875 | 391.685 |
| 0.6194444444444445 | 409.574 |
| 0.6201388888888889 | 422.943 |
| 0.6208333333333333 | 453.968 |
| 0.6215277777777778 | 467.187 |
| 0.6222222222222222 | 484.735 |
| 0.6229166666666667 | 536.82 |
| 0.6236111111111111 | 489.108 |
| 0.6243055555555556 | 471.582 |
| 0.625 | 458.38 |
| 0.6256944444444444 | 449.551 |
| 0.6263888888888889 | 445.129 |
| 0.6270833333333333 | 458.38 |
| 0.6277777777777778 | 458.38 |
| 0.6284722222222222 | 480.356 |
| 0.6291666666666667 | 484.735 |
| 0.6298611111111111 | 480.356 |
| 0.6305555555555555 | 480.356 |
| 0.63125 | 458.38 |
| 0.6319444444444444 | 600.661 |
| 0.6326388888888889 | 592.233 |
| 0.6333333333333333 | 562.53 |
| 0.6340277777777777 | 549.704 |
| 0.6347222222222222 | 553.986 |
| 0.6354166666666666 | 436.27 |
| 0.6361111111111112 | 414.035 |
| 0.6368055555555555 | 328.584 |
| 0.6375000000000001 | 373.729 |
| 0.6381944444444444 | 369.23 |
| 0.638888888888889 | 337.639 |
| 0.6395833333333333 | 351.198 |
| 0.6402777777777778 | 324.052 |
| 0.6409722222222222 | 319.517 |
| 0.6416666666666667 | 305.898 |
| 0.642361111111111 | 292.259 |
| 0.6430555555555556 | 287.709 |
| 0.6437499999999999 | 287.709 |
| 0.6444444444444445 | 278.603 |
| 0.6451388888888888 | 269.49 |
| 0.6458333333333334 | 260.373 |
| 0.6465277777777778 | 251.251 |
| 0.6472222222222223 | 246.689 |
| 0.6479166666666667 | 242.127 |
| 0.6486111111111111 | 242.127 |
| 0.6493055555555556 | 237.564 |
| 0.65 | 237.564 |
| 0.6506944444444445 | 233 |
| 0.6513888888888889 | 228.436 |
| 0.6520833333333333 | 223.873 |
| 0.6527777777777778 | 219.309 |
| 0.6534722222222222 | 219.309 |
| 0.6541666666666667 | 223.873 |
| 0.6548611111111111 | 228.436 |
| 0.6555555555555556 | 228.436 |
| 0.65625 | 228.436 |
| 0.6569444444444444 | 219.309 |
| 0.6576388888888889 | 214.746 |
| 0.6583333333333333 | 210.182 |
| 0.6590277777777778 | 210.182 |
| 0.6597222222222222 | 210.182 |
| 0.6604166666666667 | 205.62 |
| 0.6611111111111111 | 201.058 |
| 0.6618055555555555 | 196.497 |
| 0.6625 | 191.937 |
| 0.6631944444444444 | 191.937 |
| 0.6638888888888889 | 191.937 |
| 0.6645833333333333 | 196.497 |
| 0.6652777777777777 | 201.058 |
| 0.6659722222222222 | 205.62 |
| 0.6666666666666666 | 205.62 |
| 0.6673611111111111 | 205.62 |
| 0.6680555555555556 | 205.62 |
| 0.6687500000000001 | 201.058 |
| 0.6694444444444444 | 201.058 |
| 0.6701388888888888 | 205.62 |
| 0.6708333333333334 | 205.62 |
| 0.6715277777777778 | 205.62 |
| 0.6722222222222222 | 205.62 |
| 0.6729166666666666 | 210.182 |
| 0.6736111111111112 | 214.746 |
| 0.6743055555555556 | 214.746 |
| 0.6749999999999999 | 219.309 |
| 0.6756944444444444 | 219.309 |
| 0.6763888888888889 | 219.309 |
| 0.6770833333333334 | 223.873 |
| 0.6777777777777777 | 228.436 |
| 0.6784722222222223 | 233 |
| 0.6791666666666667 | 237.564 |
| 0.6798611111111111 | 242.127 |
| 0.6805555555555555 | 251.251 |
| 0.68125 | 251.251 |
| 0.6819444444444445 | 251.251 |
| 0.6826388888888889 | 251.251 |
| 0.6833333333333332 | 251.251 |
| 0.6840277777777778 | 251.251 |
| 0.6847222222222222 | 246.689 |
| 0.6854166666666667 | 242.127 |
| 0.686111111111111 | 242.127 |
| 0.6868055555555556 | 242.127 |
| 0.6875 | 246.689 |
| 0.6881944444444444 | 251.251 |
| 0.688888888888889 | 260.373 |
| 0.6895833333333333 | 264.932 |
| 0.6902777777777778 | 260.373 |
| 0.6909722222222222 | 255.813 |
| 0.6916666666666668 | 251.251 |
| 0.6923611111111111 | 246.689 |
| 0.6930555555555555 | 251.251 |
| 0.69375 | 255.813 |
| 0.6944444444444445 | 269.49 |
| 0.6951388888888889 | 287.709 |
| 0.6958333333333333 | 287.709 |
| 0.6965277777777777 | 296.808 |
| 0.6972222222222223 | 287.709 |
| 0.6979166666666666 | 292.259 |
| 0.6986111111111111 | 310.44 |
| 0.6993055555555556 | 301.354 |
| 0.7000000000000001 | 287.709 |
| 0.7006944444444444 | 274.047 |
| 0.7013888888888888 | 255.813 |
| 0.7020833333333334 | 242.127 |
| 0.7027777777777778 | 223.873 |
| 0.7034722222222222 | 210.182 |
| 0.7041666666666666 | 201.058 |
| 0.7048611111111112 | 196.497 |
| 0.7055555555555556 | 191.937 |
| 0.7062499999999999 | 187.378 |
| 0.7069444444444444 | 182.82 |
| 0.7076388888888889 | 182.82 |
| 0.7083333333333334 | 182.82 |
| 0.7090277777777777 | 182.82 |
| 0.7097222222222223 | 182.82 |
| 0.7104166666666667 | 187.378 |
| 0.7111111111111111 | 187.378 |
| 0.7118055555555555 | 187.378 |
| 0.7125 | 187.378 |
| 0.7131944444444445 | 187.378 |
| 0.7138888888888889 | 187.378 |
| 0.7145833333333332 | 187.378 |
| 0.7152777777777778 | 187.378 |
| 0.7159722222222222 | 187.378 |
| 0.7166666666666667 | 187.378 |
| 0.717361111111111 | 187.378 |
| 0.7180555555555556 | 187.378 |
| 0.71875 | 187.378 |
| 0.7194444444444444 | 187.378 |
| 0.720138888888889 | 182.82 |
| 0.7208333333333333 | 182.82 |
| 0.7215277777777778 | 182.82 |
| 0.7222222222222222 | 182.82 |
| 0.7229166666666668 | 182.82 |
| 0.7236111111111111 | 182.82 |
| 0.7243055555555555 | 178.264 |
| 0.725 | 178.264 |
| 0.7256944444444445 | 178.264 |
| 0.7263888888888889 | 173.709 |
| 0.7270833333333333 | 173.709 |
| 0.7277777777777777 | 173.709 |
| 0.7284722222222223 | 173.709 |
| 0.7291666666666666 | 173.709 |
| 0.7298611111111111 | 173.709 |
| 0.7305555555555556 | 173.709 |
| 0.7312500000000001 | 173.709 |
| 0.7319444444444444 | 178.264 |
| 0.7326388888888888 | 178.264 |
| 0.7333333333333334 | 182.82 |
| 0.7340277777777778 | 182.82 |
| 0.7347222222222222 | 187.378 |
| 0.7354166666666666 | 187.378 |
| 0.7361111111111112 | 187.378 |
| 0.7368055555555556 | 191.937 |
| 0.7374999999999999 | 191.937 |
| 0.7381944444444444 | 187.378 |
| 0.7388888888888889 | 187.378 |
| 0.7395833333333334 | 182.82 |
| 0.7402777777777777 | 182.82 |
| 0.7409722222222223 | 178.264 |
| 0.7416666666666667 | 173.709 |
| 0.7423611111111111 | 173.709 |
| 0.7430555555555555 | 173.709 |
| 0.74375 | 169.156 |
| 0.7444444444444445 | 164.605 |
| 0.7451388888888889 | 164.605 |
| 0.7458333333333332 | 160.056 |
| 0.7465277777777778 | 160.056 |
| 0.7472222222222222 | 160.056 |
| 0.7479166666666667 | 155.509 |
| 0.748611111111111 | 146.423 |
| 0.7493055555555556 | 146.423 |
| 0.75 | 141.884 |
| 0.7506944444444444 | 137.347 |
| 0.751388888888889 | 137.347 |
| 0.7520833333333333 | 132.814 |
| 0.7527777777777778 | 128.284 |
| 0.7534722222222222 | 128.284 |
| 0.7541666666666668 | 123.758 |
| 0.7548611111111111 | 119.235 |
| 0.7555555555555555 | 119.235 |
| 0.75625 | 114.716 |
| 0.7569444444444445 | 110.201 |
| 0.7576388888888889 | 110.201 |
| 0.7583333333333333 | 110.201 |
| 0.7590277777777777 | 114.716 |
| 0.7597222222222223 | 119.235 |
| 0.7604166666666666 | 114.716 |
| 0.7611111111111111 | 119.235 |
| 0.7618055555555556 | 119.235 |
| 0.7625000000000001 | 123.758 |
| 0.7631944444444444 | 123.758 |
| 0.7638888888888888 | 110.201 |
| 0.7645833333333334 | 110.201 |
| 0.7652777777777778 | 105.69 |
| 0.7659722222222222 | 96.682 |
| 0.7666666666666666 | 92.184 |
| 0.7673611111111112 | 83.205 |
| 0.7680555555555556 | 83.205 |
| 0.7687499999999999 | 78.722 |
| 0.7694444444444444 | 78.722 |
| 0.7701388888888889 | 78.722 |
| 0.7708333333333334 | 78.722 |
| 0.7715277777777777 | 74.246 |
| 0.7722222222222223 | 74.246 |
| 0.7729166666666667 | 69.775 |
| 0.7736111111111111 | 65.31 |
| 0.7743055555555555 | 60.85 |
| 0.775 | 56.398 |
| 0.7756944444444445 | 51.951 |
| 0.7763888888888889 | 47.511 |
| 0.7770833333333332 | 43.079 |
| 0.7777777777777778 | 38.653 |
| 0.7784722222222222 | 34.234 |
| 0.7791666666666667 | 29.823 |
| 0.779861111111111 | 29.823 |
| 0.7805555555555556 | 25.419 |
| 0.78125 | 21.024 |
| 0.7819444444444444 | 21.024 |
| 0.782638888888889 | 16.636 |
| 0.7833333333333333 | 16.636 |
| 0.7840277777777778 | 16.636 |
| 0.7847222222222222 | 12.257 |
| 0.7854166666666668 | 12.257 |
| 0.7861111111111111 | 12.257 |
| 0.7868055555555555 | 12.257 |
| 0.7875 | 12.257 |
| 0.7881944444444445 | 12.257 |
| 0.7888888888888889 | 12.257 |
| 0.7895833333333333 | 12.257 |
| 0.7902777777777777 | 12.257 |
| 0.7909722222222223 | 12.257 |
| 0.7916666666666666 | 12.257 |
| 0.7923611111111111 | 12.257 |
| 0.7930555555555556 | 12.257 |
| 0.7937500000000001 | 12.257 |
| 0.7944444444444444 | 12.257 |
| 0.7951388888888888 | 16.636 |
| 0.7958333333333334 | 16.636 |
| 0.7965277777777778 | 16.636 |
| 0.7972222222222222 | 21.024 |
| 0.7979166666666666 | 21.024 |
| 0.7986111111111112 | 21.024 |
| 0.7993055555555556 | 25.419 |
| 0.7999999999999999 | 29.823 |
| 0.8006944444444444 | 29.823 |
| 0.8013888888888889 | 38.653 |
| 0.8020833333333334 | 38.653 |
| 0.8027777777777777 | 38.653 |
| 0.8034722222222223 | 43.079 |
| 0.8041666666666667 | 43.079 |
| 0.8048611111111111 | 43.079 |
| 0.8055555555555555 | 43.079 |
| 0.80625 | 43.079 |
| 0.8069444444444445 | 47.511 |
| 0.8076388888888889 | 47.511 |
| 0.8083333333333332 | 43.079 |
| 0.8090277777777778 | 43.079 |
| 0.8097222222222222 | 43.079 |
| 0.8104166666666667 | 43.079 |
| 0.811111111111111 | 38.653 |
| 0.8118055555555556 | 38.653 |
| 0.8125 | 38.653 |
| 0.8131944444444444 | 38.653 |
| 0.813888888888889 | 34.234 |
| 0.8145833333333333 | 34.234 |
| 0.8152777777777778 | 34.234 |
| 0.8159722222222222 | 34.234 |
| 0.8166666666666668 | 29.823 |
| 0.8173611111111111 | 29.823 |
| 0.8180555555555555 | 29.823 |
| 0.81875 | 29.823 |
| 0.8194444444444445 | 25.419 |
| 0.8201388888888889 | 25.419 |
| 0.8208333333333333 | 25.419 |
| 0.8215277777777777 | 21.024 |
| 0.8222222222222223 | 21.024 |
| 0.8229166666666666 | 21.024 |
| 0.8236111111111111 | 21.024 |
| 0.8243055555555556 | 16.636 |
| 0.8250000000000001 | 16.636 |
| 0.8256944444444444 | 12.257 |
| 0.8263888888888888 | 12.257 |
| 0.8270833333333334 | 12.257 |
| 0.8277777777777778 | 12.257 |
| 0.8284722222222222 | 12.257 |
| 0.8291666666666666 | 12.257 |
| 0.8298611111111112 | 7.887 |
| 0.8305555555555556 | 7.887 |
| 0.8312499999999999 | 7.887 |
| 0.8319444444444444 | 7.887 |
| 0.8326388888888889 | 3.525 |
| 0.8333333333333334 | 3.525 |
| 0.8340277777777777 | 3.525 |
| 0.8347222222222223 | 3.525 |
| 0.8354166666666667 | 3.525 |
| 0.8361111111111111 | 3.525 |
| 0.8368055555555555 | 3.525 |
| 0.8375 | 3.525 |
| 0.8381944444444445 | 3.525 |
| 0.8388888888888889 | 0 |
| 0.8395833333333332 | 0 |
| 0.8402777777777778 | 0 |
| 0.8409722222222222 | 0 |
| 0.8416666666666667 | 0 |
| 0.842361111111111 | 0 |
| 0.8430555555555556 | 0 |
| 0.84375 | 0 |
| 0.8444444444444444 | 0 |
| 0.845138888888889 | 0 |
| 0.8458333333333333 | 0 |
| 0.8465277777777778 | 0 |
| 0.8472222222222222 | 0 |
| 0.8479166666666668 | 0 |
| 0.8486111111111111 | 0 |
| 0.8493055555555555 | 0 |
| 0.85 | 0 |
| 0.8506944444444445 | 0 |
| 0.8513888888888889 | 0 |
| 0.8520833333333333 | 0 |
| 0.8527777777777777 | 0 |
| 0.8534722222222223 | 0 |
| 0.8541666666666666 | 0 |
| 0.8548611111111111 | 0 |
| 0.8555555555555556 | 0 |
| 0.8562500000000001 | 0 |
| 0.8569444444444444 | 0 |
| 0.8576388888888888 | 0 |
| 0.8583333333333334 | 0 |
| 0.8590277777777778 | 0 |
| 0.8597222222222222 | 0 |
| 0.8604166666666666 | 0 |
| 0.8611111111111112 | 0 |
| 0.8618055555555556 | 0 |
| 0.8624999999999999 | 0 |
| 0.8631944444444444 | 0 |
| 0.8638888888888889 | 0 |
| 0.8645833333333334 | 0 |
| 0.8652777777777777 | 0 |
| 0.8659722222222223 | 0 |
| 0.8666666666666667 | 0 |
| 0.8673611111111111 | 0 |
| 0.8680555555555555 | 0 |
| 0.86875 | 0 |
| 0.8694444444444445 | 0 |
| 0.8701388888888889 | 0 |
| 0.8708333333333332 | 0 |
| 0.8715277777777778 | 0 |
| 0.8722222222222222 | 0 |
| 0.8729166666666667 | 0 |
| 0.873611111111111 | 0 |
| 0.8743055555555556 | 0 |
| 0.875 | 0 |
| 0.8756944444444444 | 0 |
| 0.876388888888889 | 0 |
| 0.8770833333333333 | 0 |
| 0.8777777777777778 | 0 |
| 0.8784722222222222 | 0 |
| 0.8791666666666668 | 0 |
| 0.8798611111111111 | 0 |
| 0.8805555555555555 | 0 |
| 0.88125 | 0 |
| 0.8819444444444445 | 0 |
| 0.8826388888888889 | 0 |
| 0.8833333333333333 | 0 |
| 0.8840277777777777 | 0 |
| 0.8847222222222223 | 0 |
| 0.8854166666666666 | 0 |
| 0.8861111111111111 | 0 |
| 0.8868055555555556 | 0 |
| 0.8875000000000001 | 0 |
| 0.8881944444444444 | 0 |
| 0.8888888888888888 | 0 |
| 0.8895833333333334 | 0 |
| 0.8902777777777778 | 0 |
| 0.8909722222222222 | 0 |
| 0.8916666666666666 | 0 |
| 0.8923611111111112 | 0 |
| 0.8930555555555556 | 0 |
| 0.8937499999999999 | 0 |
| 0.8944444444444444 | 0 |
| 0.8951388888888889 | 0 |
| 0.8958333333333334 | 0 |
| 0.8965277777777777 | 0 |
| 0.8972222222222223 | 0 |
| 0.8979166666666667 | 0 |
| 0.8986111111111111 | 0 |
| 0.8993055555555555 | 0 |
| 0.9 | 0 |
| 0.9006944444444445 | 0 |
| 0.9013888888888889 | 0 |
| 0.9020833333333332 | 0 |
| 0.9027777777777778 | 0 |
| 0.9034722222222222 | 0 |
| 0.9041666666666667 | 0 |
| 0.904861111111111 | 0 |
| 0.9055555555555556 | 0 |
| 0.90625 | 0 |
| 0.9069444444444444 | 0 |
| 0.907638888888889 | 0 |
| 0.9083333333333333 | 0 |
| 0.9090277777777778 | 0 |
| 0.9097222222222222 | 0 |
| 0.9104166666666668 | 0 |
| 0.9111111111111111 | 0 |
| 0.9118055555555555 | 0 |
| 0.9125 | 0 |
| 0.9131944444444445 | 0 |
| 0.9138888888888889 | 0 |
| 0.9145833333333333 | 0 |
| 0.9152777777777777 | 0 |
| 0.9159722222222223 | 0 |
| 0.9166666666666666 | 0 |
| 0.9173611111111111 | 0 |
| 0.9180555555555556 | 0 |
| 0.9187500000000001 | 0 |
| 0.9194444444444444 | 0 |
| 0.9201388888888888 | 0 |
| 0.9208333333333334 | 0 |
| 0.9215277777777778 | 0 |
| 0.9222222222222222 | 0 |
| 0.9229166666666666 | 0 |
| 0.9236111111111112 | 0 |
| 0.9243055555555556 | 0 |
| 0.9249999999999999 | 0 |
| 0.9256944444444444 | 0 |
| 0.9263888888888889 | 0 |
| 0.9270833333333334 | 0 |
| 0.9277777777777777 | 0 |
| 0.9284722222222223 | 0 |
| 0.9291666666666667 | 0 |
| 0.9298611111111111 | 0 |
| 0.9305555555555555 | 0 |
| 0.93125 | 0 |
| 0.9319444444444445 | 0 |
| 0.9326388888888889 | 0 |
| 0.9333333333333332 | 0 |
| 0.9340277777777778 | 0 |
| 0.9347222222222222 | 0 |
| 0.9354166666666667 | 0 |
| 0.936111111111111 | 0 |
| 0.9368055555555556 | 0 |
| 0.9375 | 0 |
| 0.9381944444444444 | 0 |
| 0.938888888888889 | 0 |
| 0.9395833333333333 | 0 |
| 0.9402777777777778 | 0 |
| 0.9409722222222222 | 0 |
| 0.9416666666666668 | 0 |
| 0.9423611111111111 | 0 |
| 0.9430555555555555 | 0 |
| 0.94375 | 0 |
| 0.9444444444444445 | 0 |
| 0.9451388888888889 | 0 |
| 0.9458333333333333 | 0 |
| 0.9465277777777777 | 0 |
| 0.9472222222222223 | 0 |
| 0.9479166666666666 | 0 |
| 0.9486111111111111 | 0 |
| 0.9493055555555556 | 0 |
| 0.9500000000000001 | 0 |
| 0.9506944444444444 | 0 |
| 0.9513888888888888 | 0 |
| 0.9520833333333334 | 0 |
| 0.9527777777777778 | 0 |
| 0.9534722222222222 | 0 |
| 0.9541666666666666 | 0 |
| 0.9548611111111112 | 0 |
| 0.9555555555555556 | 0 |
| 0.9562499999999999 | 0 |
| 0.9569444444444444 | 0 |
| 0.9576388888888889 | 0 |
| 0.9583333333333334 | 0 |
| 0.9590277777777777 | 0 |
| 0.9597222222222223 | 0 |
| 0.9604166666666667 | 0 |
| 0.9611111111111111 | 0 |
| 0.9618055555555555 | 0 |
| 0.9625 | 0 |
| 0.9631944444444445 | 0 |
| 0.9638888888888889 | 0 |
| 0.9645833333333332 | 0 |
| 0.9652777777777778 | 0 |
| 0.9659722222222222 | 0 |
| 0.9666666666666667 | 0 |
| 0.967361111111111 | 0 |
| 0.9680555555555556 | 0 |
| 0.96875 | 0 |
| 0.9694444444444444 | 0 |
| 0.970138888888889 | 0 |
| 0.9708333333333333 | 0 |
| 0.9715277777777778 | 0 |
| 0.9722222222222222 | 0 |
| 0.9729166666666668 | 0 |
| 0.9736111111111111 | 0 |
| 0.9743055555555555 | 0 |
| 0.975 | 0 |
| 0.9756944444444445 | 0 |
| 0.9763888888888889 | 0 |
| 0.9770833333333333 | 0 |
| 0.9777777777777777 | 0 |
| 0.9784722222222223 | 0 |
| 0.9791666666666666 | 0 |
| 0.9798611111111111 | 0 |
| 0.9805555555555556 | 0 |
| 0.9812500000000001 | 0 |
| 0.9819444444444444 | 0 |
| 0.9826388888888888 | 0 |
| 0.9833333333333334 | 0 |
| 0.9840277777777778 | 0 |
| 0.9847222222222222 | 0 |
| 0.9854166666666666 | 0 |
| 0.9861111111111112 | 0 |
| 0.9868055555555556 | 0 |
| 0.9874999999999999 | 0 |
| 0.9881944444444444 | 0 |
| 0.9888888888888889 | 0 |
| 0.9895833333333334 | 0 |
| 0.9902777777777777 | 0 |
| 0.9909722222222223 | 0 |
| 0.9916666666666667 | 0 |
| 0.9923611111111111 | 0 |
| 0.9930555555555555 | 0 |
| 0.99375 | 0 |
| 0.9944444444444445 | 0 |
| 0.9951388888888889 | 0 |
| 0.9958333333333332 | 0 |
| 0.9965277777777778 | 0 |
| 0.9972222222222222 | 0 |
| 0.9979166666666667 | 0 |
| 0.998611111111111 | 0 |
| 0.9993055555555556 | 0 |